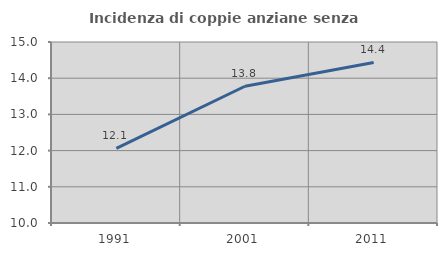
| Category | Incidenza di coppie anziane senza figli  |
|---|---|
| 1991.0 | 12.06 |
| 2001.0 | 13.778 |
| 2011.0 | 14.435 |